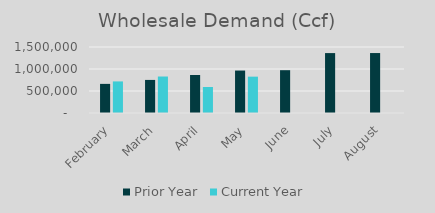
| Category | Prior Year | Current Year |
|---|---|---|
| February | 661790 | 717715 |
| March | 751769 | 829129 |
| April | 864122 | 591056.98 |
| May | 964707 | 825870 |
| June | 973004 | 0 |
| July | 1361707 | 0 |
| August | 1362622 | 0 |